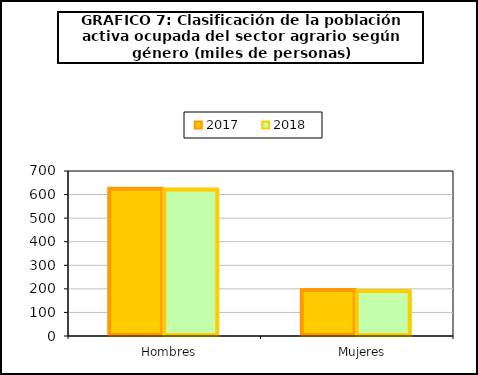
| Category | 2017 | 2018 |
|---|---|---|
|    Hombres | 624.7 | 621.4 |
|    Mujeres | 194.9 | 191.125 |